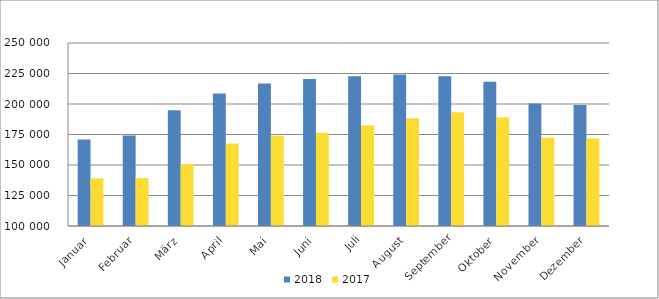
| Category | 2018 | 2017 |
|---|---|---|
| Januar | 170977 | 139027 |
| Februar | 174274 | 139239 |
| März | 194869 | 150687 |
| April | 208567 | 167713 |
| Mai | 216876 | 174055 |
| Juni | 220589 | 176457 |
| Juli | 222783 | 182393 |
| August | 224105 | 188334 |
| September | 222727 | 193258 |
| Oktober | 218166 | 189228 |
| November | 200475 | 172272 |
| Dezember | 199096 | 171814 |